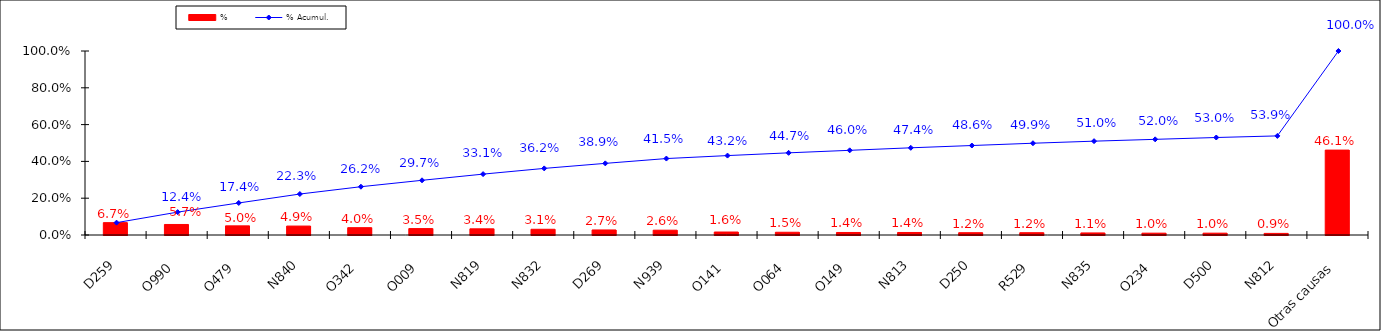
| Category | % |
|---|---|
| D259 | 0.067 |
| O990 | 0.057 |
| O479 | 0.05 |
| N840 | 0.049 |
| O342 | 0.04 |
| O009 | 0.035 |
| N819 | 0.034 |
| N832 | 0.031 |
| D269 | 0.027 |
| N939 | 0.026 |
| O141 | 0.016 |
| O064 | 0.015 |
| O149 | 0.014 |
| N813 | 0.014 |
| D250 | 0.012 |
| R529 | 0.012 |
| N835 | 0.011 |
| O234 | 0.01 |
| D500 | 0.01 |
| N812 | 0.009 |
| Otras causas | 0.461 |